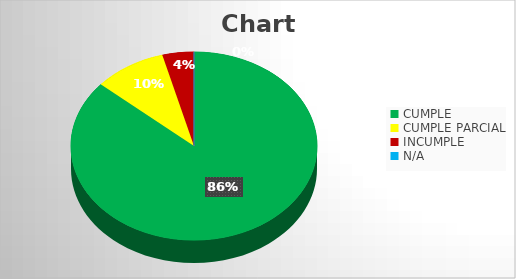
| Category | Series 0 |
|---|---|
| CUMPLE | 209 |
| CUMPLE PARCIAL | 23 |
| INCUMPLE | 10 |
| N/A | 0 |